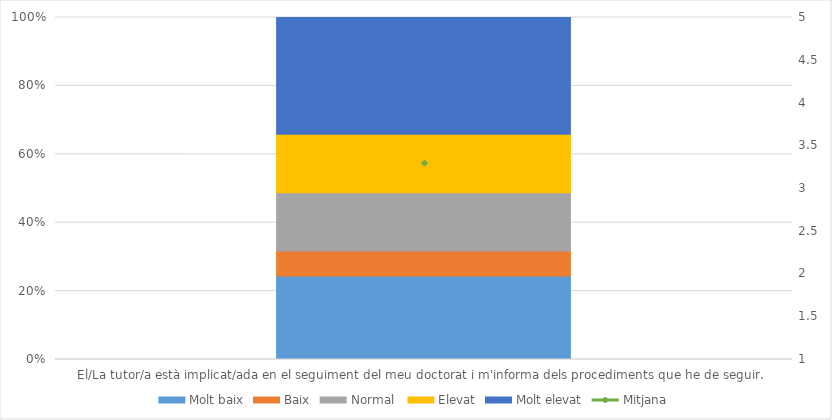
| Category | Molt baix | Baix | Normal  | Elevat | Molt elevat |
|---|---|---|---|---|---|
| El/La tutor/a està implicat/ada en el seguiment del meu doctorat i m'informa dels procediments que he de seguir.  | 10 | 3 | 7 | 7 | 14 |